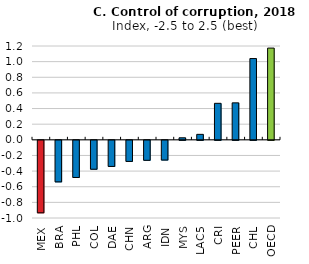
| Category | Series 0 |
|---|---|
| MEX | -0.928 |
| BRA | -0.532 |
| PHL | -0.475 |
| COL | -0.37 |
| DAE | -0.334 |
| CHN | -0.27 |
| ARG | -0.256 |
| IDN | -0.252 |
| MYS | 0.026 |
| LAC5 | 0.07 |
| CRI | 0.467 |
| PEER | 0.473 |
| CHL | 1.039 |
| OECD | 1.173 |